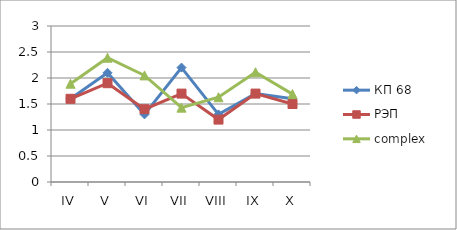
| Category | КП 68 | РЭП  | complex |
|---|---|---|---|
| IV | 1.6 | 1.6 | 1.89 |
| V | 2.1 | 1.9 | 2.39 |
| VI | 1.3 | 1.4 | 2.05 |
| VII | 2.2 | 1.7 | 1.43 |
| VIII | 1.3 | 1.2 | 1.63 |
| IX | 1.7 | 1.7 | 2.11 |
| X | 1.6 | 1.5 | 1.69 |